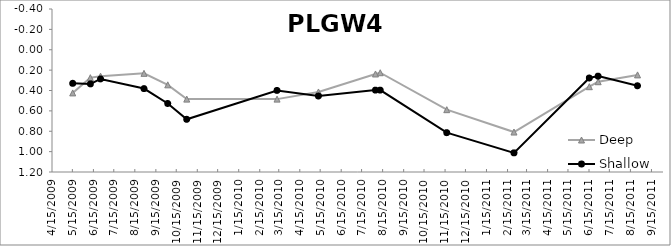
| Category | Deep | Shallow |
|---|---|---|
| 5/15/09 | 0.424 | 0.329 |
| 6/10/09 | 0.274 | 0.335 |
| 6/25/09 | 0.259 | 0.286 |
| 8/28/09 | 0.232 | 0.381 |
| 10/2/09 | 0.344 | 0.527 |
| 10/30/09 | 0.485 | 0.683 |
| 3/12/10 | 0.485 | 0.399 |
| 5/12/10 | 0.415 | 0.454 |
| 8/4/10 | 0.238 | 0.396 |
| 8/11/10 | 0.226 | 0.396 |
| 11/17/10 | 0.588 | 0.814 |
| 2/24/11 | 0.808 | 1.012 |
| 6/15/11 | 0.363 | 0.277 |
| 6/28/11 | 0.314 | 0.259 |
| 8/25/11 | 0.247 | 0.354 |